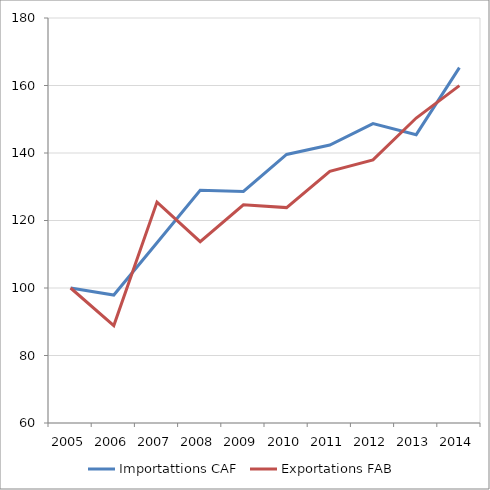
| Category | Importattions CAF | Exportations FAB |
|---|---|---|
| 2005.0 | 100 | 100 |
| 2006.0 | 97.913 | 88.856 |
| 2007.0 | 113.419 | 125.458 |
| 2008.0 | 128.926 | 113.725 |
| 2009.0 | 128.628 | 124.641 |
| 2010.0 | 139.563 | 123.824 |
| 2011.0 | 142.346 | 134.542 |
| 2012.0 | 148.708 | 137.941 |
| 2013.0 | 145.427 | 150.359 |
| 2014.0 | 165.308 | 159.967 |